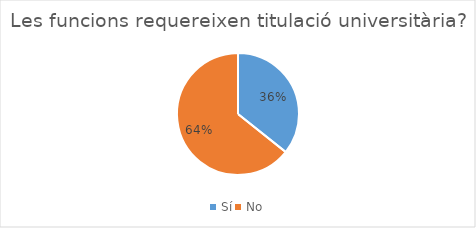
| Category | Series 0 |
|---|---|
| Sí | 10 |
| No | 18 |